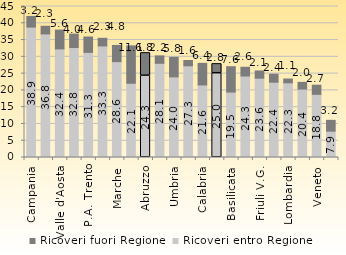
| Category | Ricoveri entro Regione | Ricoveri fuori Regione |
|---|---|---|
| Campania | 38.859 | 3.174 |
| Sardegna | 36.816 | 2.293 |
| Valle d'Aosta | 32.373 | 5.597 |
| Liguria | 32.769 | 3.989 |
| P.A. Trento | 31.321 | 4.587 |
| Lazio | 33.258 | 2.265 |
| Marche | 28.566 | 4.825 |
| Molise | 22.127 | 11.139 |
| Abruzzo | 24.307 | 6.783 |
| Toscana | 28.074 | 2.208 |
| Umbria | 24.031 | 5.816 |
| P.A. Bolzano | 27.323 | 1.577 |
| Calabria | 21.617 | 6.443 |
| ITALIA | 25.047 | 2.775 |
| Basilicata | 19.504 | 7.555 |
| Piemonte | 24.28 | 2.615 |
| Friuli V.G. | 23.641 | 2.149 |
| Emilia Romagna | 22.442 | 2.375 |
| Lombardia | 22.258 | 1.136 |
| Sicilia | 20.386 | 2.007 |
| Veneto | 18.827 | 2.727 |
| Puglia | 7.852 | 3.226 |